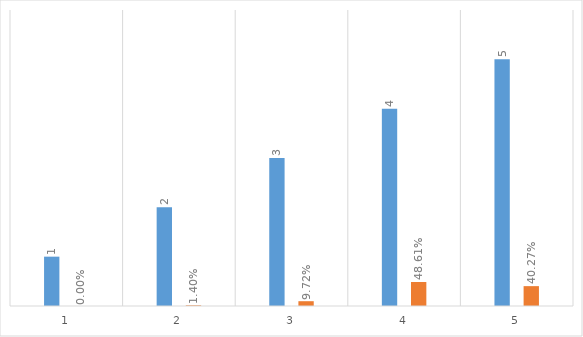
| Category | Series 0 | Series 1 |
|---|---|---|
| 0 | 1 | 0 |
| 1 | 2 | 0.014 |
| 2 | 3 | 0.097 |
| 3 | 4 | 0.486 |
| 4 | 5 | 0.403 |